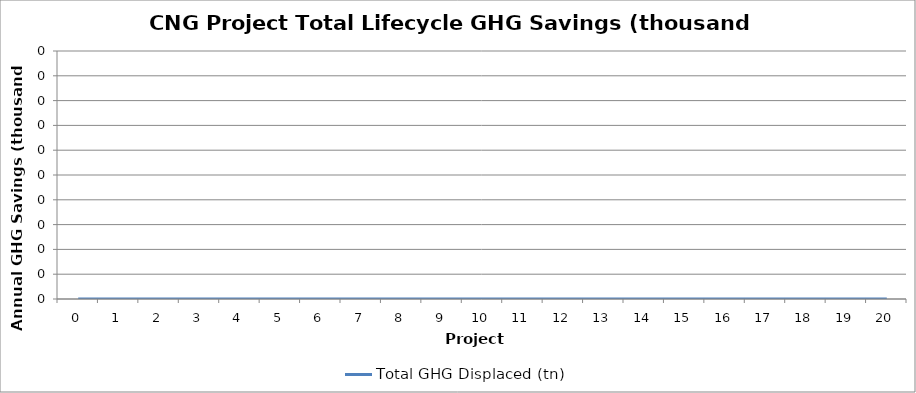
| Category | Total GHG Displaced (tn) |
|---|---|
| 0.0 | 0 |
| 1.0 | 0 |
| 2.0 | 0 |
| 3.0 | 0 |
| 4.0 | 0 |
| 5.0 | 0 |
| 6.0 | 0 |
| 7.0 | 0 |
| 8.0 | 0 |
| 9.0 | 0 |
| 10.0 | 0 |
| 11.0 | 0 |
| 12.0 | 0 |
| 13.0 | 0 |
| 14.0 | 0 |
| 15.0 | 0 |
| 16.0 | 0 |
| 17.0 | 0 |
| 18.0 | 0 |
| 19.0 | 0 |
| 20.0 | 0 |